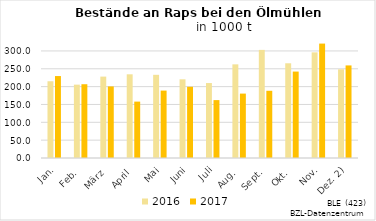
| Category | 2016 | 2017 |
|---|---|---|
| Jan. | 215.005 | 229.588 |
| Feb. | 205.517 | 206.692 |
| März | 228.031 | 200.539 |
| April | 234.481 | 157.986 |
| Mai | 233.038 | 188.865 |
| Juni | 220.467 | 199.531 |
| Juli | 210.009 | 162.204 |
| Aug. | 262.383 | 180.458 |
| Sept. | 302.876 | 188.313 |
| Okt. | 265.376 | 242.155 |
| Nov. | 295.971 | 320.563 |
| Dez. 2) | 248.459 | 259.384 |